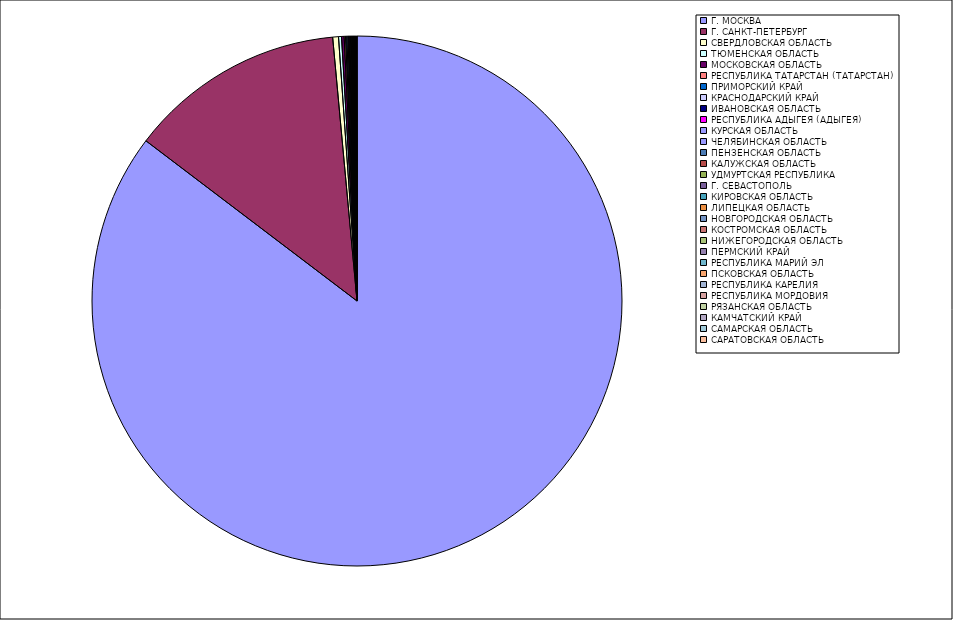
| Category | Оборот |
|---|---|
| Г. МОСКВА | 85.264 |
| Г. САНКТ-ПЕТЕРБУРГ | 13.193 |
| СВЕРДЛОВСКАЯ ОБЛАСТЬ | 0.351 |
| ТЮМЕНСКАЯ ОБЛАСТЬ | 0.182 |
| МОСКОВСКАЯ ОБЛАСТЬ | 0.156 |
| РЕСПУБЛИКА ТАТАРСТАН (ТАТАРСТАН) | 0.086 |
| ПРИМОРСКИЙ КРАЙ | 0.074 |
| КРАСНОДАРСКИЙ КРАЙ | 0.067 |
| ИВАНОВСКАЯ ОБЛАСТЬ | 0.066 |
| РЕСПУБЛИКА АДЫГЕЯ (АДЫГЕЯ) | 0.048 |
| КУРСКАЯ ОБЛАСТЬ | 0.042 |
| ЧЕЛЯБИНСКАЯ ОБЛАСТЬ | 0.042 |
| ПЕНЗЕНСКАЯ ОБЛАСТЬ | 0.038 |
| КАЛУЖСКАЯ ОБЛАСТЬ | 0.031 |
| УДМУРТСКАЯ РЕСПУБЛИКА | 0.031 |
| Г. СЕВАСТОПОЛЬ | 0.03 |
| КИРОВСКАЯ ОБЛАСТЬ | 0.03 |
| ЛИПЕЦКАЯ ОБЛАСТЬ | 0.021 |
| НОВГОРОДСКАЯ ОБЛАСТЬ | 0.02 |
| КОСТРОМСКАЯ ОБЛАСТЬ | 0.02 |
| НИЖЕГОРОДСКАЯ ОБЛАСТЬ | 0.019 |
| ПЕРМСКИЙ КРАЙ | 0.015 |
| РЕСПУБЛИКА МАРИЙ ЭЛ | 0.014 |
| ПСКОВСКАЯ ОБЛАСТЬ | 0.013 |
| РЕСПУБЛИКА КАРЕЛИЯ | 0.013 |
| РЕСПУБЛИКА МОРДОВИЯ | 0.012 |
| РЯЗАНСКАЯ ОБЛАСТЬ | 0.012 |
| КАМЧАТСКИЙ КРАЙ | 0.011 |
| САМАРСКАЯ ОБЛАСТЬ | 0.01 |
| САРАТОВСКАЯ ОБЛАСТЬ | 0.01 |